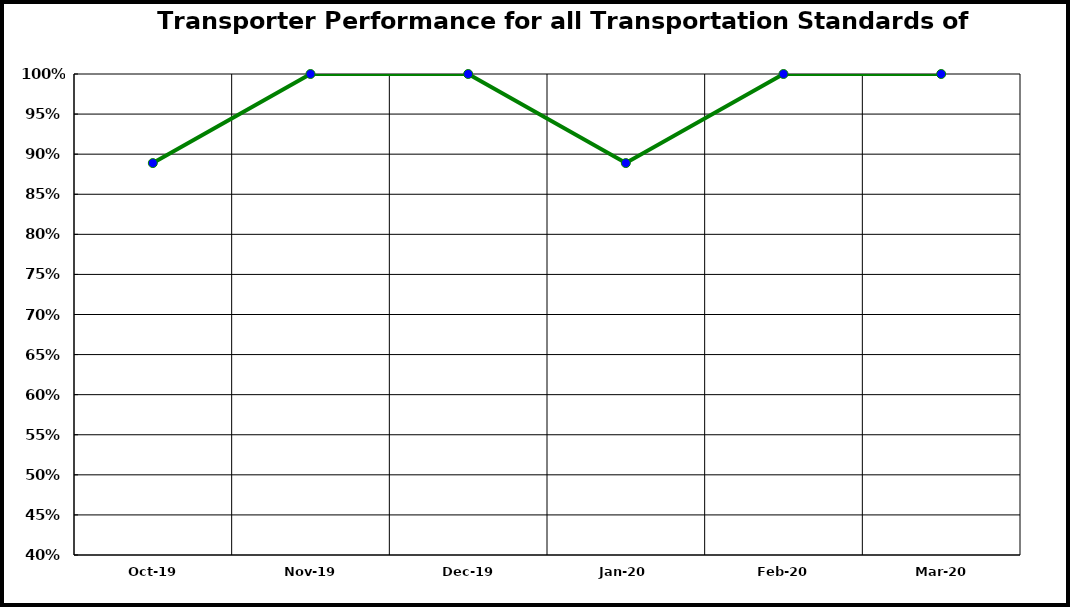
| Category | Performance |
|---|---|
| 2019-10-01 | 0.889 |
| 2019-11-01 | 1 |
| 2019-12-01 | 1 |
| 2020-01-01 | 0.889 |
| 2020-02-01 | 1 |
| 2020-03-01 | 1 |